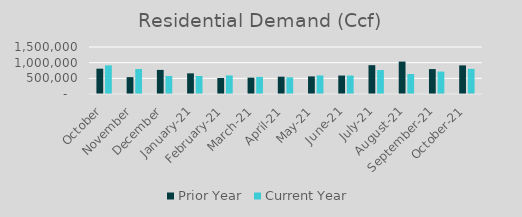
| Category | Prior Year | Current Year |
|---|---|---|
| October | 808030.57 | 913450.318 |
| November | 537591.016 | 796803.85 |
| December | 768795.205 | 575698.992 |
| January-21 | 659359.876 | 574964.407 |
| February-21 | 510296.309 | 591912.627 |
| March-21 | 521598.856 | 545392.69 |
| April-21 | 552550.404 | 533967.423 |
| May-21 | 561680.927 | 591911.753 |
| June-21 | 588815.728 | 587861.265 |
| July-21 | 920418.723 | 764849.567 |
| August-21 | 1034271.241 | 637451.79 |
| September-21 | 795392.365 | 715703.433 |
| October-21 | 913450.318 | 802383.882 |